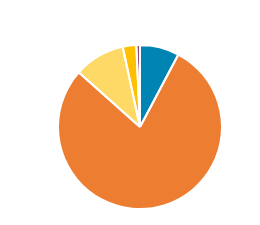
| Category | Series 0 |
|---|---|
|  | 1335 |
|  | 13596 |
|  | 1725 |
|  | 461 |
|  | 124 |